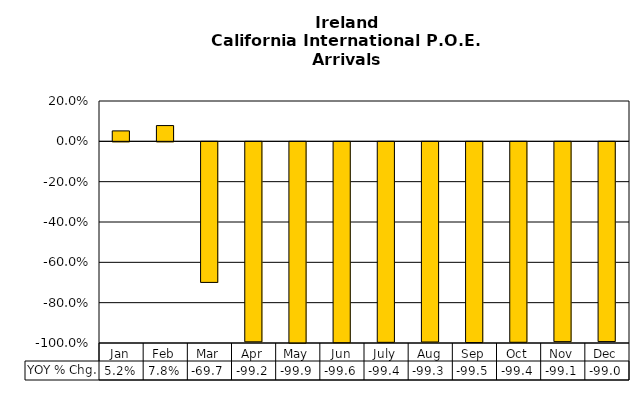
| Category | YOY % Chg. |
|---|---|
| Jan | 0.052 |
| Feb | 0.078 |
| Mar | -0.697 |
| Apr | -0.992 |
| May | -0.999 |
| Jun | -0.996 |
| July | -0.994 |
| Aug | -0.993 |
| Sep | -0.995 |
| Oct | -0.994 |
| Nov | -0.991 |
| Dec | -0.99 |